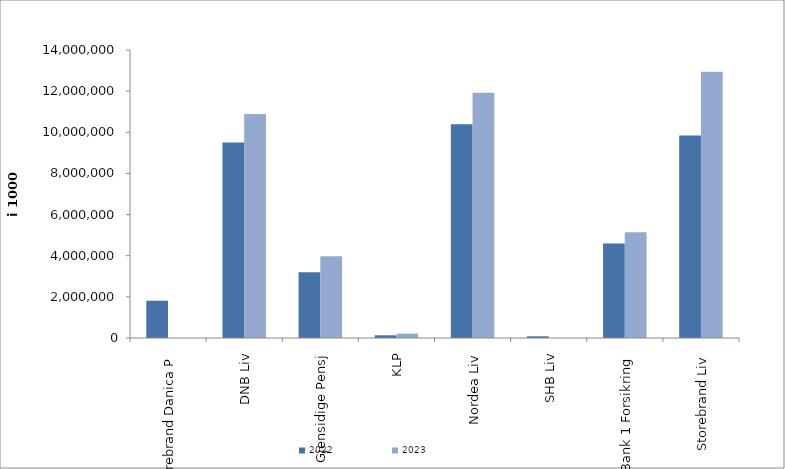
| Category | 2022 | 2023 |
|---|---|---|
| Storebrand Danica P | 1811787.29 | 0 |
| DNB Liv | 9504232 | 10894333 |
| Gjensidige Pensj | 3199959 | 3973127 |
| KLP | 131709.472 | 212341.893 |
| Nordea Liv | 10389567.608 | 11926469.427 |
| SHB Liv | 82933.02 | 0 |
| SpareBank 1 Forsikring | 4592774.789 | 5140181.311 |
| Storebrand Liv | 9839028.086 | 12946913.09 |